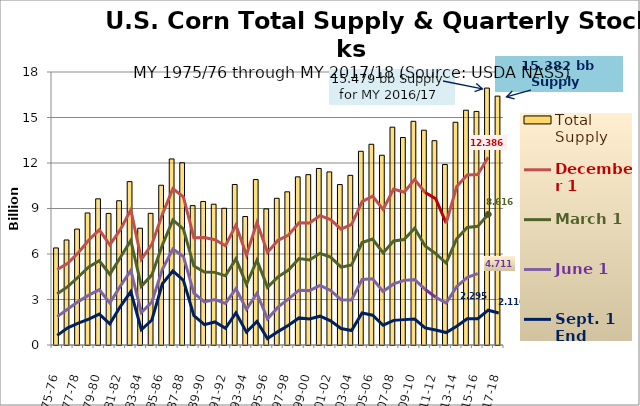
| Category | Total Supply |
|---|---|
| 1975-76 | 6.4 |
| 1976-77 | 6.925 |
| 1977-78 | 7.643 |
| 1978-79 | 8.705 |
| 1979-80 | 9.638 |
| 1980-81 | 8.675 |
| 1981-82 | 9.511 |
| 1982-83 | 10.772 |
| 1983-84 | 7.699 |
| 1984-85 | 8.68 |
| 1985-86 | 10.534 |
| 1986-87 | 12.267 |
| 1987-88 | 12.016 |
| 1988-89 | 9.191 |
| 1989-90 | 9.464 |
| 1990-91 | 9.282 |
| 1991-92 | 9.016 |
| 1992-93 | 10.584 |
| 1993-94 | 8.472 |
| 1994-95 | 10.91 |
| 1995-96 | 8.974 |
| 1996-97 | 9.672 |
| 1997-98 | 10.099 |
| 1998-99 | 11.085 |
| 1999-00 | 11.232 |
| 2000-01 | 11.639 |
| 2001-02 | 11.412 |
| 2002-03 | 10.578 |
| 2003-04 | 11.188 |
| 2004-05 | 12.775 |
| 2005-06 | 13.235 |
| 2006-07 | 12.51 |
| 2007-08 | 14.362 |
| 2008-09 | 13.681 |
| 2009-10 | 14.749 |
| 2010-11 | 14.161 |
| 2011-12 | 13.471 |
| 2012-13 | 11.904 |
| 2013-14 | 14.686 |
| 2014-15 | 15.479 |
| 2015-16 | 15.401 |
| 2016-17 | 16.94 |
| 2017-18 | 16.41 |